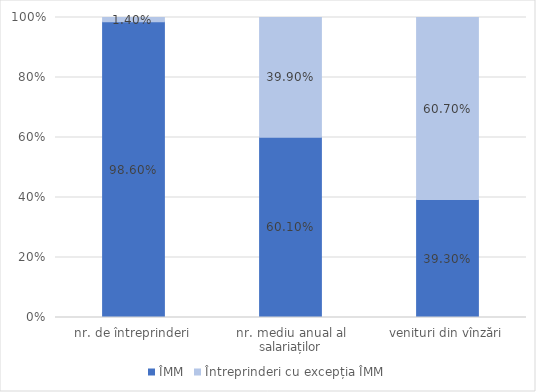
| Category | ÎMM | Întreprinderi cu excepția ÎMM |
|---|---|---|
| nr. de întreprinderi | 0.986 | 0.014 |
| nr. mediu anual al salariaților | 0.601 | 0.399 |
| venituri din vînzări | 0.393 | 0.607 |